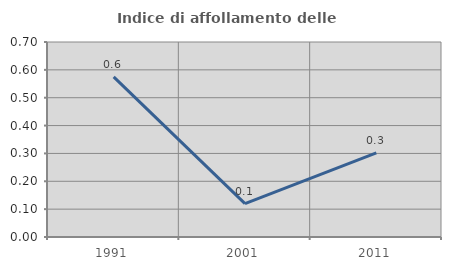
| Category | Indice di affollamento delle abitazioni  |
|---|---|
| 1991.0 | 0.575 |
| 2001.0 | 0.12 |
| 2011.0 | 0.302 |